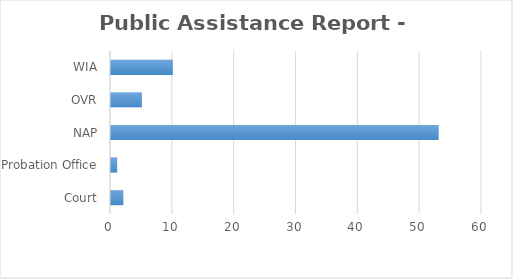
| Category | Series 0 |
|---|---|
| Court | 2 |
| Probation Office | 1 |
| NAP | 53 |
| OVR | 5 |
| WIA | 10 |